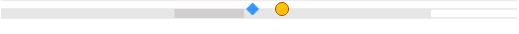
| Category | left | mid start | mid end | right |
|---|---|---|---|---|
| 0 | 0 | 0.403 | 0.162 | 0.435 |